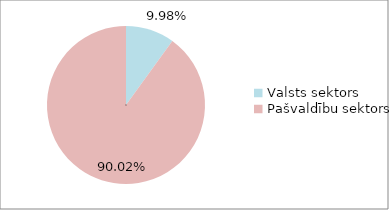
| Category | Series 0 |
|---|---|
| Valsts sektors | 0.1 |
| Pašvaldību sektors | 0.9 |